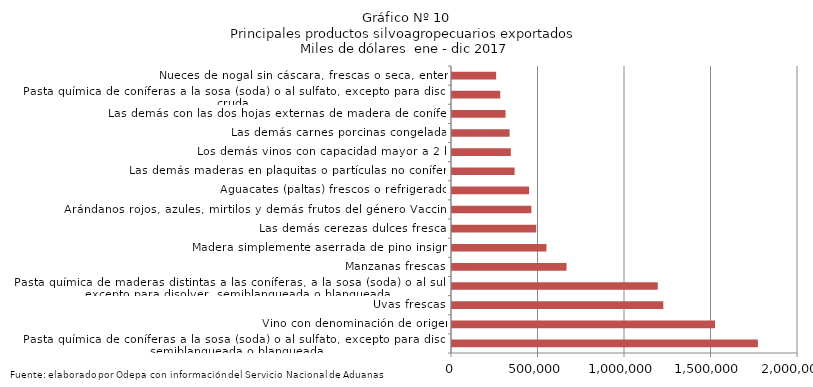
| Category | Series 0 |
|---|---|
| Pasta química de coníferas a la sosa (soda) o al sulfato, excepto para disolver, semiblanqueada o blanqueada | 1768197.746 |
| Vino con denominación de origen | 1520237.14 |
| Uvas frescas | 1221531.781 |
| Pasta química de maderas distintas a las coníferas, a la sosa (soda) o al sulfato, excepto para disolver, semiblanqueada o blanqueada | 1189413.516 |
| Manzanas frescas | 662002.361 |
| Madera simplemente aserrada de pino insigne | 546072.809 |
| Las demás cerezas dulces frescas | 486725.607 |
| Arándanos rojos, azules, mirtilos y demás frutos del género Vaccinium | 458841.715 |
| Aguacates (paltas) frescos o refrigerados | 445819.797 |
| Las demás maderas en plaquitas o partículas no coníferas | 361944.546 |
| Los demás vinos con capacidad mayor a 2 lts | 340129.354 |
| Las demás carnes porcinas congeladas | 332906.095 |
| Las demás con las dos hojas externas de madera de coníferas | 309577.956 |
| Pasta química de coníferas a la sosa (soda) o al sulfato, excepto para disolver, cruda | 278880.009 |
| Nueces de nogal sin cáscara, frescas o seca, enteras | 255277.098 |